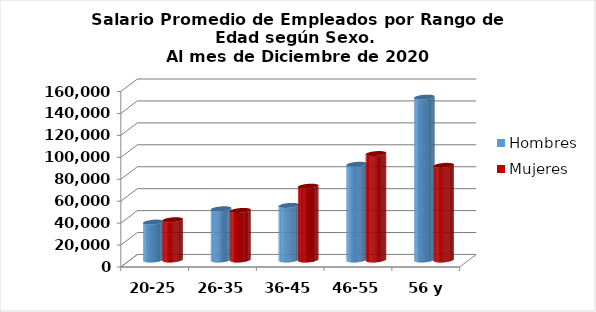
| Category | Hombres | Mujeres |
|---|---|---|
| 20-25 | 34556 | 36708 |
| 26-35 | 46688 | 45180 |
| 36-45 | 49770 | 67291 |
| 46-55 | 87286 | 97046 |
| 56 y más | 148500 | 86281 |